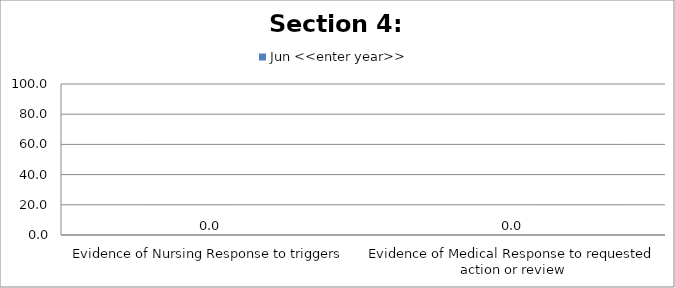
| Category | Jun <<enter year>> |
|---|---|
| Evidence of Nursing Response to triggers | 0 |
| Evidence of Medical Response to requested action or review | 0 |